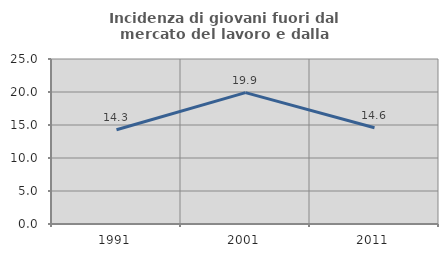
| Category | Incidenza di giovani fuori dal mercato del lavoro e dalla formazione  |
|---|---|
| 1991.0 | 14.286 |
| 2001.0 | 19.907 |
| 2011.0 | 14.583 |